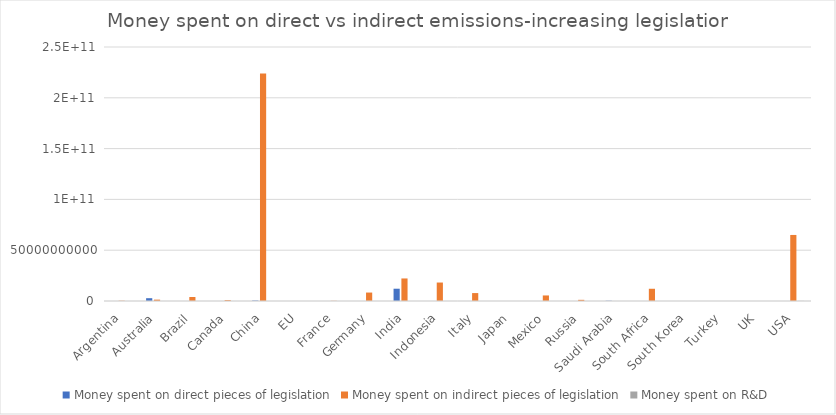
| Category | Money spent on direct pieces of legislation | Money spent on indirect pieces of legislation | Money spent on R&D |
|---|---|---|---|
| Argentina | 0 | 262600000 | 0 |
| Australia | 2759100000 | 1338403160.906 | 0 |
| Brazil | 0 | 3912600000 | 0 |
| Canada | 0 | 890178000 | 0 |
| China | 455000000 | 224000000000 | 0 |
| EU | 0 | 0 | 0 |
| France | 0 | 171000000 | 0 |
| Germany | 0 | 8316000000 | 0 |
| India | 12090000000 | 22193730000 | 0 |
| Indonesia | 0 | 18179550000 | 0 |
| Italy | 0 | 7797080000 | 0 |
| Japan | 0 | 0 | 0 |
| Mexico | 4148367.256 | 5460000000 | 0 |
| Russia | 0 | 1149680000 | 0 |
| Saudi Arabia | 243000000 | 0 | 0 |
| South Africa | 0 | 12042600000 | 0 |
| South Korea | 0 | 0 | 0 |
| Turkey | 0 | 0 | 0 |
| UK | 0 | 0 | 0 |
| USA | 0 | 65000000000 | 122000000 |